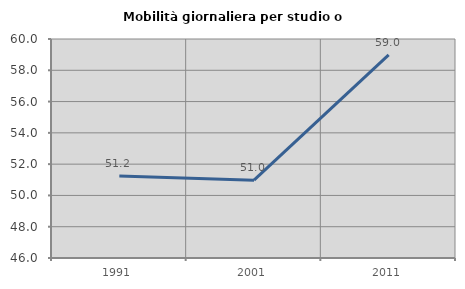
| Category | Mobilità giornaliera per studio o lavoro |
|---|---|
| 1991.0 | 51.237 |
| 2001.0 | 50.975 |
| 2011.0 | 58.979 |